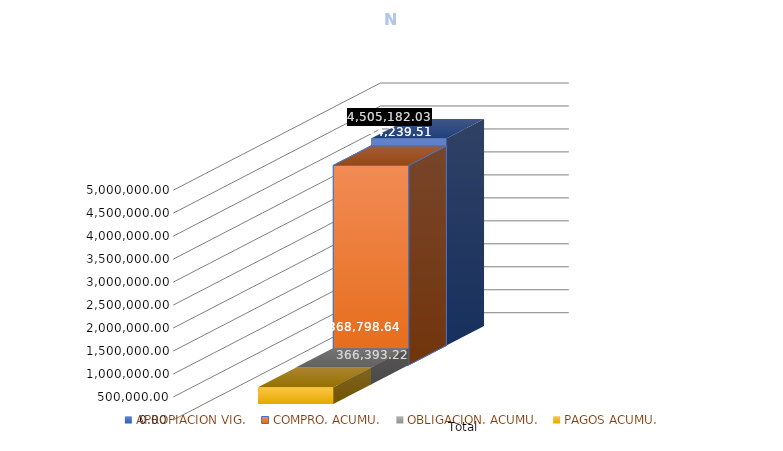
| Category | APROPIACION VIG. | COMPRO. ACUMU. | OBLIGACION. ACUMU. | PAGOS ACUMU. |
|---|---|---|---|---|
| Total | 4505182025012 | 4344239510621.73 | 368798635090.2 | 366393217075.2 |